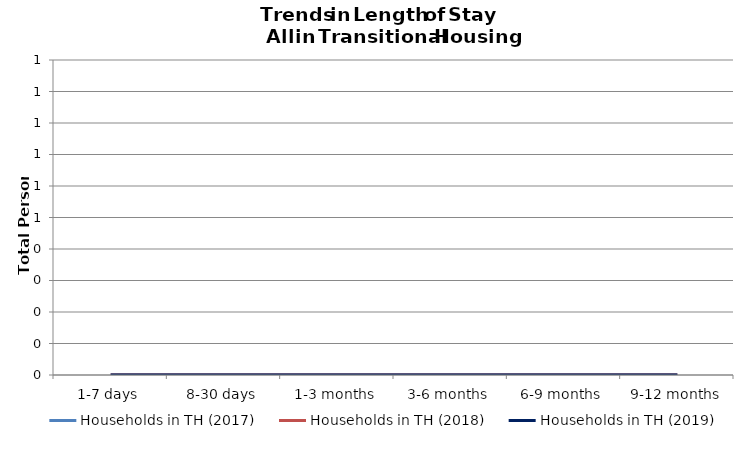
| Category | Households in TH (2017) | Households in TH (2018) | Households in TH (2019) |
|---|---|---|---|
| 1-7 days | 0 | 0 | 0 |
| 8-30 days | 0 | 0 | 0 |
| 1-3 months | 0 | 0 | 0 |
| 3-6 months | 0 | 0 | 0 |
| 6-9 months | 0 | 0 | 0 |
| 9-12 months | 0 | 0 | 0 |